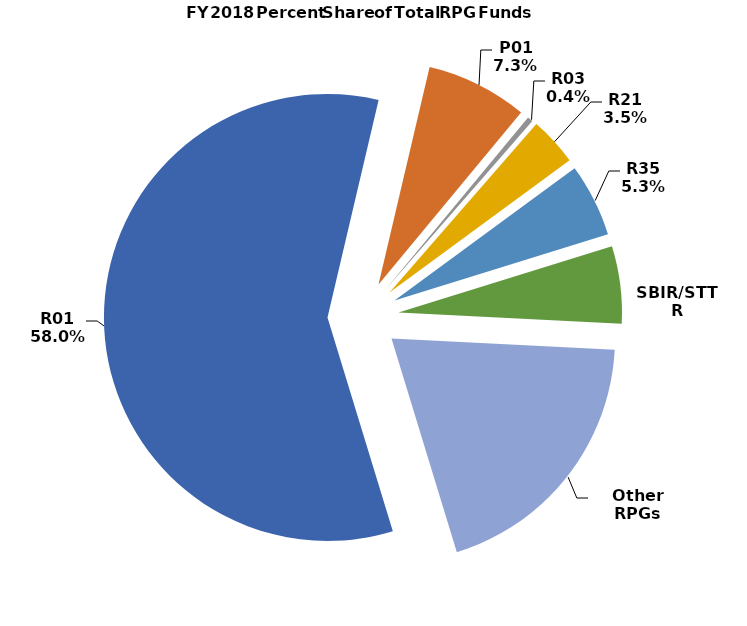
| Category | Series 1 |
|---|---|
| R01 | 0.58 |
| P01 | 0.073 |
| R03 | 0.004 |
| R21 | 0.035 |
| R35 | 0.053 |
| SBIR/STTR | 0.056 |
| Other RPGs | 0.194 |